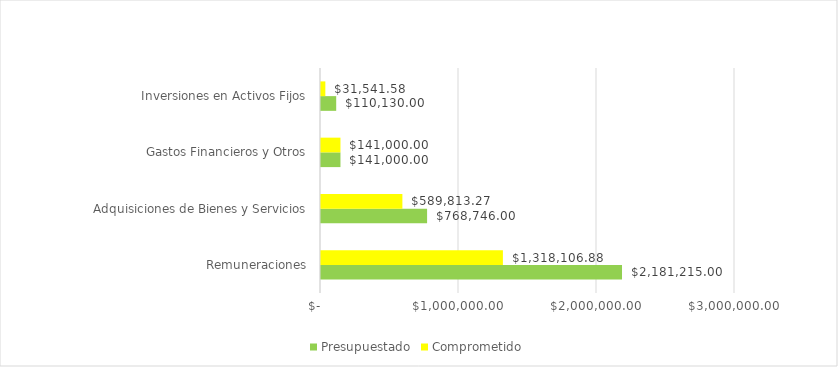
| Category |  Presupuestado  |  Comprometido  |
|---|---|---|
| Remuneraciones | 2181215 | 1318106.88 |
| Adquisiciones de Bienes y Servicios | 768746 | 589813.27 |
| Gastos Financieros y Otros | 141000 | 141000 |
| Inversiones en Activos Fijos | 110130 | 31541.58 |